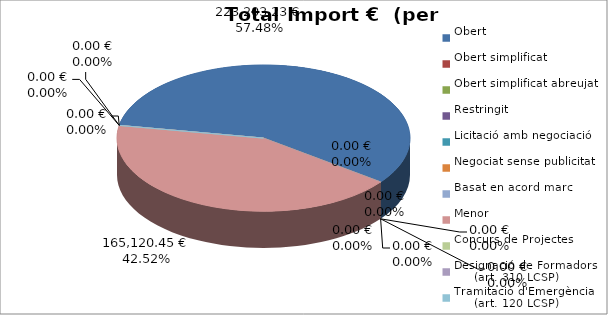
| Category | Total preu
(amb IVA) |
|---|---|
| Obert | 223203.23 |
| Obert simplificat | 0 |
| Obert simplificat abreujat | 0 |
| Restringit | 0 |
| Licitació amb negociació | 0 |
| Negociat sense publicitat | 0 |
| Basat en acord marc | 0 |
| Menor | 165120.45 |
| Concurs de Projectes | 0 |
| Designació de Formadors
     (art. 310 LCSP) | 0 |
| Tramitació d'Emergència
     (art. 120 LCSP) | 0 |